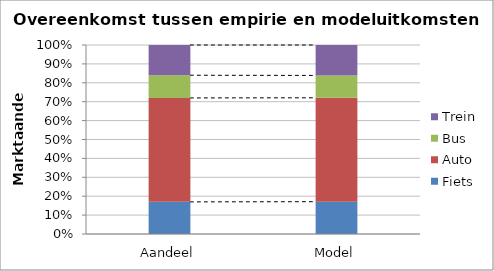
| Category | Fiets | Auto | Bus | Trein |
|---|---|---|---|---|
| Aandeel | 0.17 | 0.55 | 0.12 | 0.16 |
| Model | 0.171 | 0.55 | 0.118 | 0.161 |